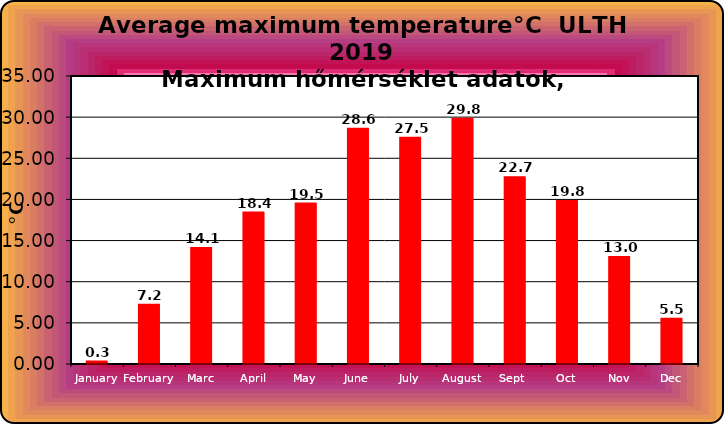
| Category | Series 0 |
|---|---|
| January | 0.3 |
| February | 7.2 |
| Marc | 14.1 |
| April | 18.4 |
| May | 19.5 |
| June | 28.6 |
| July | 27.5 |
| August | 29.8 |
| Sept  | 22.7 |
| Oct | 19.8 |
| Nov | 13 |
| Dec | 5.5 |